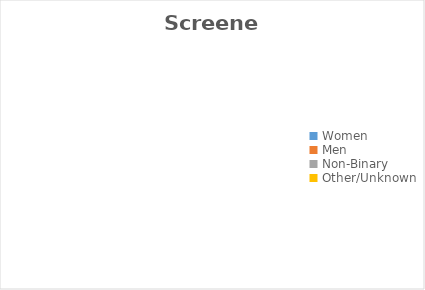
| Category | Screened |
|---|---|
| Women | 0 |
| Men | 0 |
| Non-Binary | 0 |
| Other/Unknown | 0 |